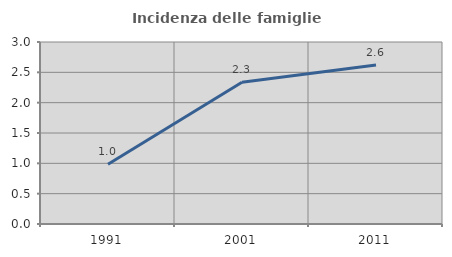
| Category | Incidenza delle famiglie numerose |
|---|---|
| 1991.0 | 0.985 |
| 2001.0 | 2.336 |
| 2011.0 | 2.62 |